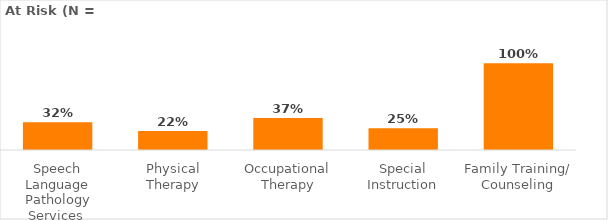
| Category | At Risk (N = ) |
|---|---|
| Speech Language Pathology Services  | 0.32 |
| Physical Therapy | 0.22 |
| Occupational Therapy | 0.37 |
| Special Instruction | 0.25 |
| Family Training/ Counseling | 1 |